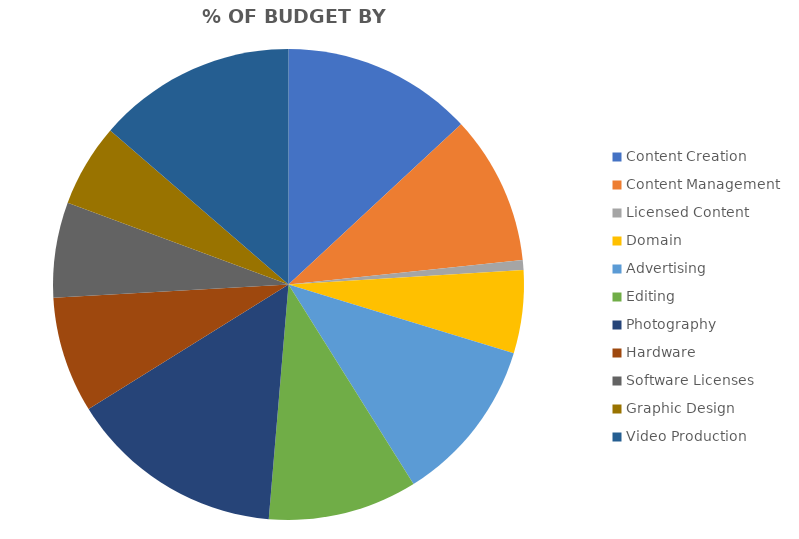
| Category | Series 0 | Series 1 |
|---|---|---|
| Content Creation | 23000 | 0.131 |
| Content Management | 18000 | 0.102 |
| Licensed Content | 1200 | 0.007 |
| Domain | 10000 | 0.057 |
| Advertising | 20000 | 0.114 |
| Editing | 18000 | 0.102 |
| Photography | 26000 | 0.148 |
| Hardware | 14000 | 0.08 |
| Software Licenses | 11500 | 0.065 |
| Graphic Design | 10000 | 0.057 |
| Video Production | 24000 | 0.137 |